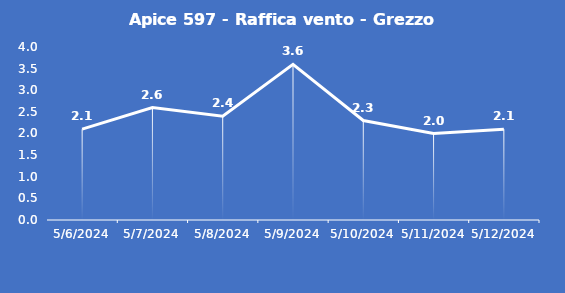
| Category | Apice 597 - Raffica vento - Grezzo (m/s) |
|---|---|
| 5/6/24 | 2.1 |
| 5/7/24 | 2.6 |
| 5/8/24 | 2.4 |
| 5/9/24 | 3.6 |
| 5/10/24 | 2.3 |
| 5/11/24 | 2 |
| 5/12/24 | 2.1 |